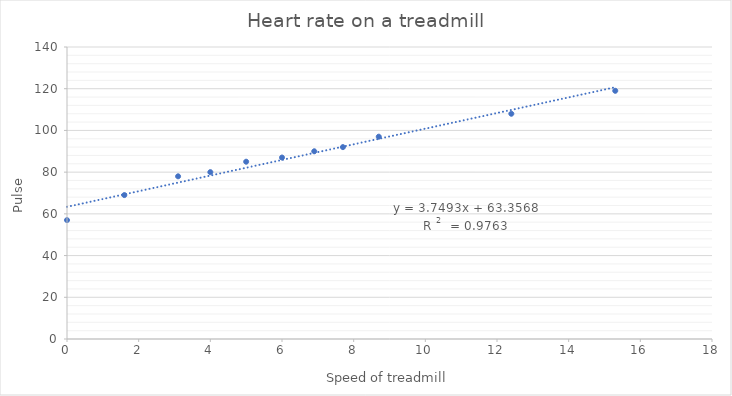
| Category | Pulse |
|---|---|
| 0.0 | 57 |
| 1.6 | 69 |
| 3.1 | 78 |
| 4.0 | 80 |
| 5.0 | 85 |
| 6.0 | 87 |
| 6.9 | 90 |
| 7.7 | 92 |
| 8.7 | 97 |
| 12.4 | 108 |
| 15.3 | 119 |